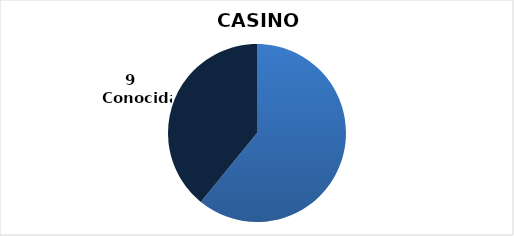
| Category | Series 0 |
|---|---|
| 0 | 14 |
| 1 | 9 |